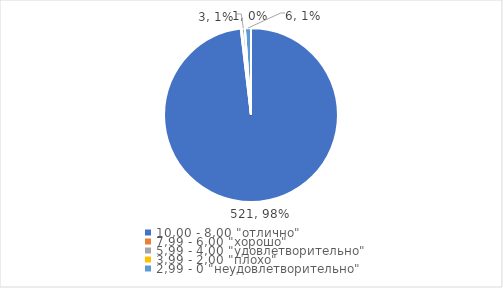
| Category | Series 0 | Series 1 |
|---|---|---|
| 10,00 - 8,00 "отлично" | 521 | 0.981 |
| 7,99 - 6,00 "хорошо" | 1 | 0.002 |
| 5,99 - 4,00 "удовлетворительно" | 3 | 0.006 |
| 3,99 - 2,00 "плохо" | 0 | 0 |
| 2,99 - 0 "неудовлетворительно" | 6 | 0.011 |